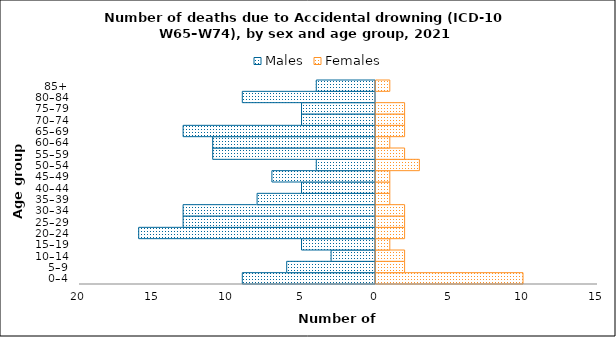
| Category | Males | Females |
|---|---|---|
| 0–4 | -9 | 10 |
| 5–9 | -6 | 2 |
| 10–14 | -3 | 2 |
| 15–19 | -5 | 1 |
| 20–24 | -16 | 2 |
| 25–29 | -13 | 2 |
| 30–34 | -13 | 2 |
| 35–39 | -8 | 1 |
| 40–44 | -5 | 1 |
| 45–49 | -7 | 1 |
| 50–54 | -4 | 3 |
| 55–59 | -11 | 2 |
| 60–64 | -11 | 1 |
| 65–69 | -13 | 2 |
| 70–74 | -5 | 2 |
| 75–79 | -5 | 2 |
| 80–84 | -9 | 0 |
| 85+ | -4 | 1 |